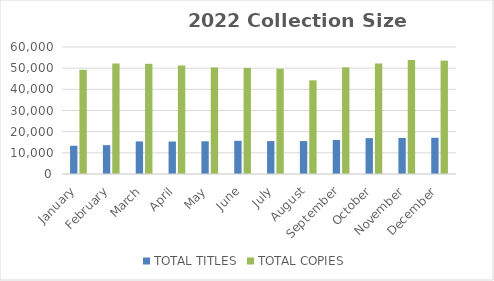
| Category | TOTAL TITLES | TOTAL COPIES |
|---|---|---|
| January | 13338 | 49238 |
| February | 13630 | 52205 |
| March | 15382 | 52066 |
| April | 15342 | 51217 |
| May | 15435 | 50266 |
| June | 15686 | 50104 |
| July | 15549 | 49717 |
| August | 15542 | 44253 |
| September | 16052 | 50409 |
| October | 16950 | 52196 |
| November | 17050 | 53887 |
| December | 17115 | 53558 |